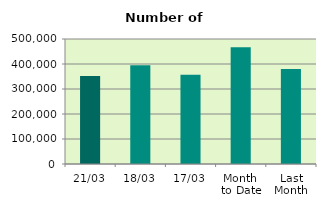
| Category | Series 0 |
|---|---|
| 21/03 | 351556 |
| 18/03 | 395418 |
| 17/03 | 356796 |
| Month 
to Date | 467046.533 |
| Last
Month | 380345.4 |